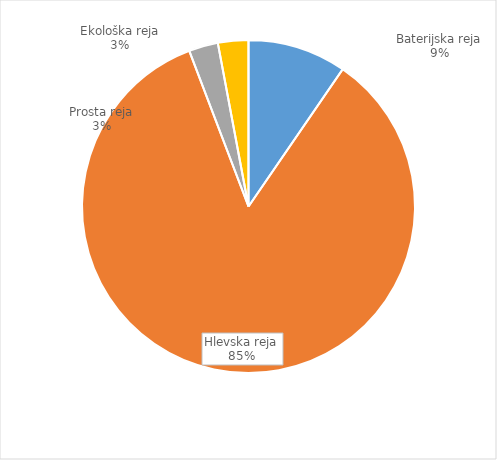
| Category | Količina kosov jajc |
|---|---|
| Baterijska reja | 323469 |
| Hlevska reja | 2859952 |
| Prosta reja | 95841 |
| Ekološka reja | 99800 |